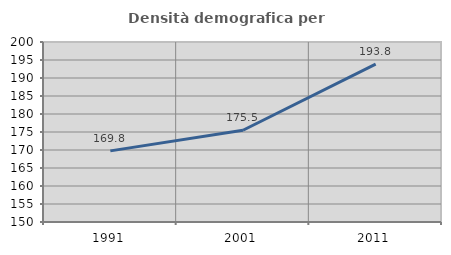
| Category | Densità demografica |
|---|---|
| 1991.0 | 169.754 |
| 2001.0 | 175.488 |
| 2011.0 | 193.84 |